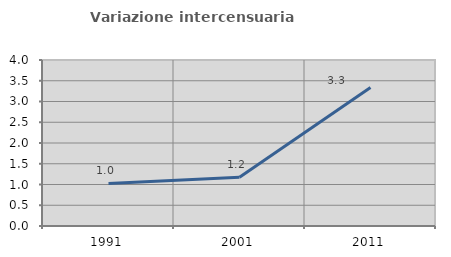
| Category | Variazione intercensuaria annua |
|---|---|
| 1991.0 | 1.026 |
| 2001.0 | 1.173 |
| 2011.0 | 3.336 |